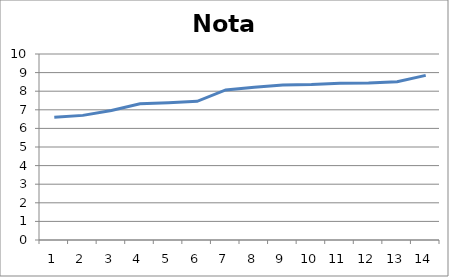
| Category | Nota mitja |
|---|---|
| 0 | 6.6 |
| 1 | 6.7 |
| 2 | 6.967 |
| 3 | 7.322 |
| 4 | 7.383 |
| 5 | 7.456 |
| 6 | 8.067 |
| 7 | 8.217 |
| 8 | 8.328 |
| 9 | 8.356 |
| 10 | 8.422 |
| 11 | 8.444 |
| 12 | 8.511 |
| 13 | 8.85 |